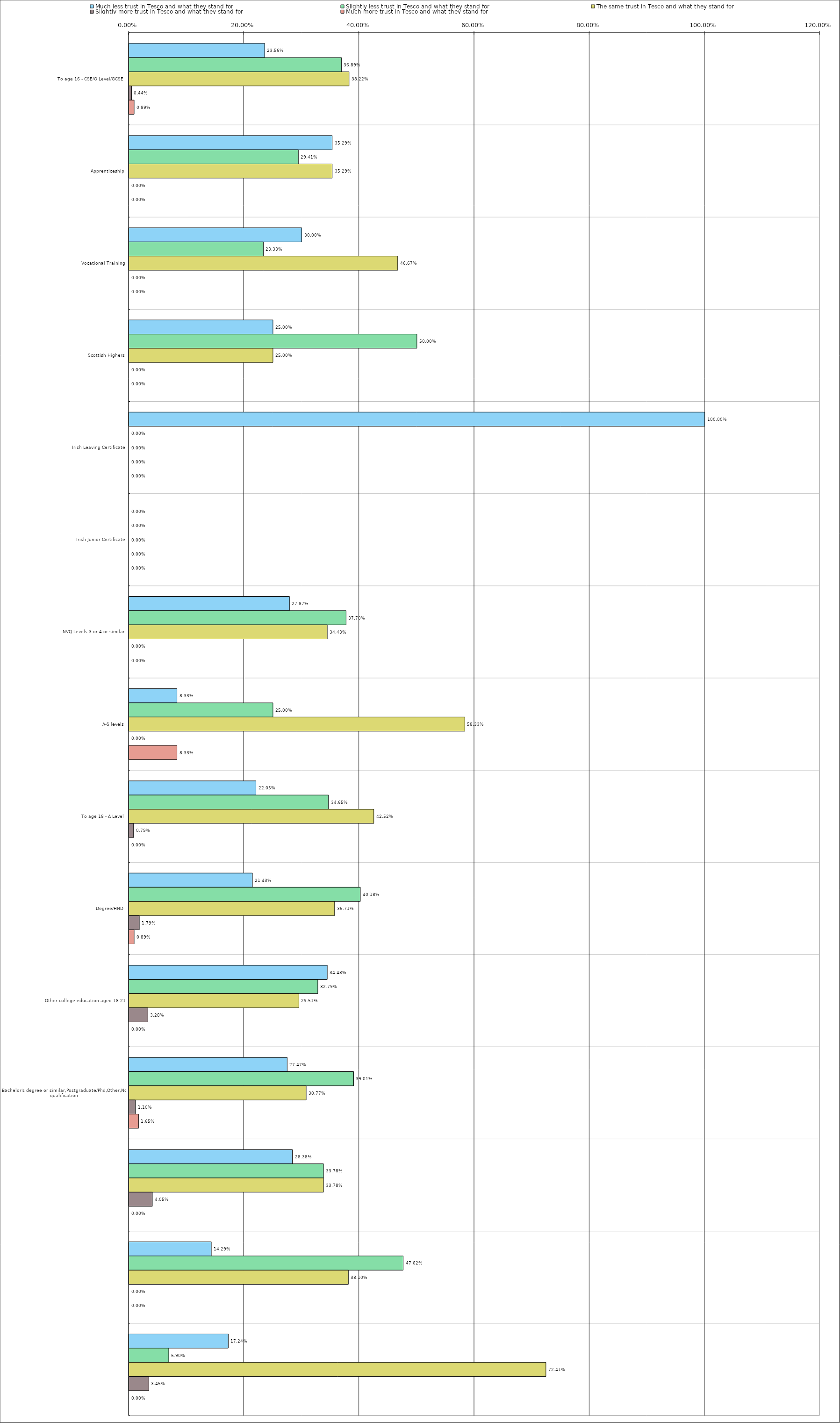
| Category | Much less trust in Tesco and what they stand for | Slightly less trust in Tesco and what they stand for | The same trust in Tesco and what they stand for | Slightly more trust in Tesco and what they stand for | Much more trust in Tesco and what they stand for |
|---|---|---|---|---|---|
| 0 | 0.236 | 0.369 | 0.382 | 0.004 | 0.009 |
| 1 | 0.353 | 0.294 | 0.353 | 0 | 0 |
| 2 | 0.3 | 0.233 | 0.467 | 0 | 0 |
| 3 | 0.25 | 0.5 | 0.25 | 0 | 0 |
| 4 | 1 | 0 | 0 | 0 | 0 |
| 5 | 0 | 0 | 0 | 0 | 0 |
| 6 | 0.279 | 0.377 | 0.344 | 0 | 0 |
| 7 | 0.083 | 0.25 | 0.583 | 0 | 0.083 |
| 8 | 0.22 | 0.346 | 0.425 | 0.008 | 0 |
| 9 | 0.214 | 0.402 | 0.357 | 0.018 | 0.009 |
| 10 | 0.344 | 0.328 | 0.295 | 0.033 | 0 |
| 11 | 0.275 | 0.39 | 0.308 | 0.011 | 0.016 |
| 12 | 0.284 | 0.338 | 0.338 | 0.04 | 0 |
| 13 | 0.143 | 0.476 | 0.381 | 0 | 0 |
| 14 | 0.172 | 0.069 | 0.724 | 0.034 | 0 |